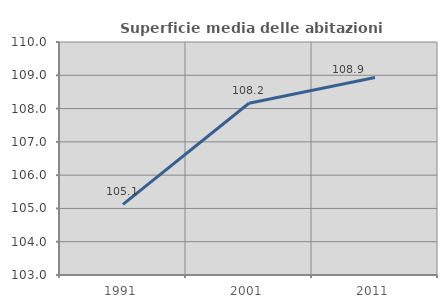
| Category | Superficie media delle abitazioni occupate |
|---|---|
| 1991.0 | 105.121 |
| 2001.0 | 108.159 |
| 2011.0 | 108.933 |